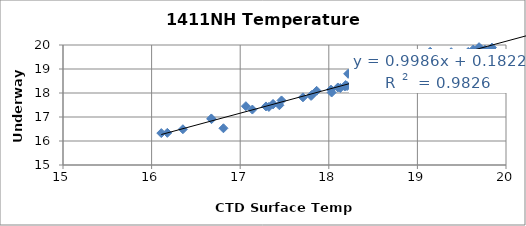
| Category | Temp |
|---|---|
| 19.603 | 20.36 |
| 19.144 | 19.72 |
| 20.6104 | 20.85 |
| 20.5017 | 20.73 |
| 20.246 | 20.43 |
| 20.318 | 20.48 |
| 19.696 | 19.91 |
| 19.6301 | 19.81 |
| 19.9738 | 20.06 |
| 19.3611 | 19.47 |
| 19.4371 | 19.48 |
| 19.609 | 19.68 |
| 19.7152 | 19.79 |
| 19.3289 | 19.28 |
| 19.2507 | 19.35 |
| 20.3486 | 20.39 |
| 19.3812 | 19.7 |
| 19.2546 | 19.38 |
| 19.3878 | 19.45 |
| 19.5365 | 19.61 |
| 19.574 | 19.71 |
| 19.5745 | 19.65 |
| 19.4482 | 19.57 |
| 19.0528 | 19.18 |
| 18.5395 | 18.72 |
| 19.3736 | 19.55 |
| 19.8409 | 19.89 |
| 19.7062 | 19.8 |
| 19.7626 | 19.8 |
| 18.9483 | 19.24 |
| 19.125 | 19.4 |
| 19.1564 | 19.43 |
| 19.151 | 19.49 |
| 19.7185 | 19.82 |
| 19.6578 | 19.74 |
| 19.4603 | 19.57 |
| 17.8627 | 18.09 |
| 17.4666 | 17.69 |
| 17.7081 | 17.82 |
| 16.1096 | 16.33 |
| 18.13 | 18.21 |
| 18.2063 | 18.29 |
| 18.7966 | 18.9 |
| 18.7434 | 18.9 |
| 18.6787 | 18.79 |
| 19.7593 | 19.78 |
| 19.466 | 19.61 |
| 18.2183 | 18.8 |
| 18.025 | 18.14 |
| 18.1804 | 18.27 |
| 17.8091 | 17.92 |
| 16.6742 | 16.94 |
| 17.3704 | 17.54 |
| 17.1374 | 17.31 |
| 16.6763 | 16.91 |
| 18.4188 | 18.51 |
| 18.1018 | 18.23 |
| 19.6118 | 19.56 |
| 18.6796 | 18.72 |
| 17.7998 | 17.88 |
| 17.3715 | 17.53 |
| 17.3235 | 17.42 |
| 16.3533 | 16.49 |
| 17.4424 | 17.49 |
| 17.2911 | 17.44 |
| 17.0642 | 17.45 |
| 16.8109 | 16.53 |
| 16.1775 | 16.34 |
| 18.0321 | 18.02 |
| 18.1901 | 18.33 |
| 18.8113 | 18.93 |
| 18.6131 | 19.07 |
| 18.6448 | 18.99 |
| 18.3367 | 18.45 |